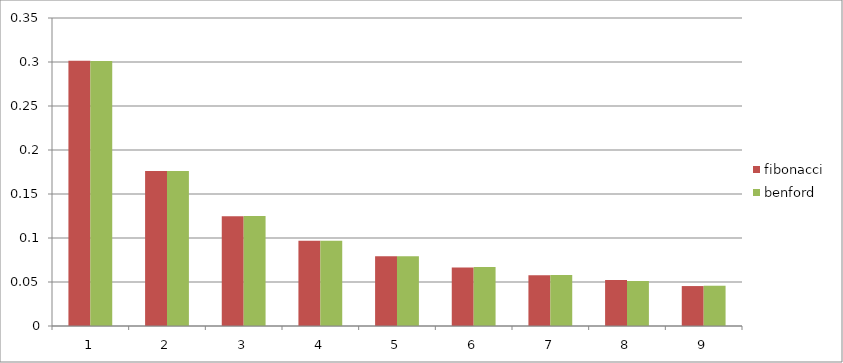
| Category | fibonacci | benford |
|---|---|---|
| 0 | 0.301 | 0.301 |
| 1 | 0.176 | 0.176 |
| 2 | 0.125 | 0.125 |
| 3 | 0.097 | 0.097 |
| 4 | 0.079 | 0.079 |
| 5 | 0.066 | 0.067 |
| 6 | 0.058 | 0.058 |
| 7 | 0.052 | 0.051 |
| 8 | 0.045 | 0.046 |